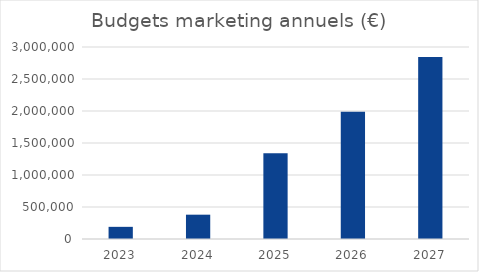
| Category | Series 0 |
|---|---|
| 2023.0 | 190000 |
| 2024.0 | 380000 |
| 2025.0 | 1340000 |
| 2026.0 | 1990000 |
| 2027.0 | 2845000 |